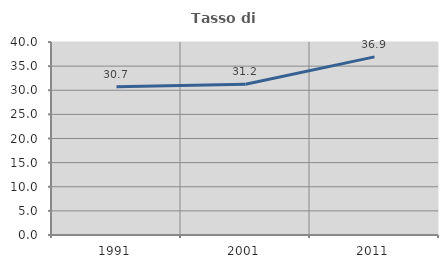
| Category | Tasso di occupazione   |
|---|---|
| 1991.0 | 30.706 |
| 2001.0 | 31.247 |
| 2011.0 | 36.92 |